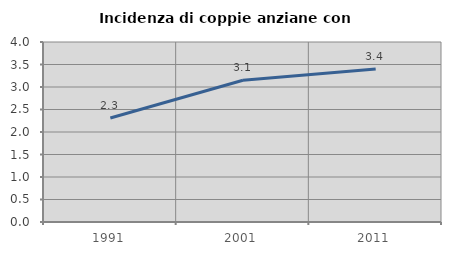
| Category | Incidenza di coppie anziane con figli |
|---|---|
| 1991.0 | 2.312 |
| 2001.0 | 3.15 |
| 2011.0 | 3.401 |